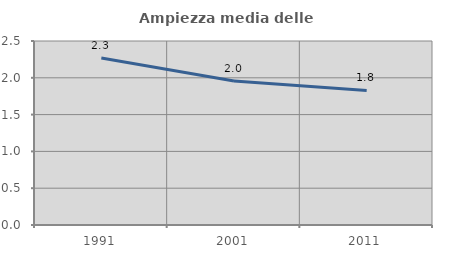
| Category | Ampiezza media delle famiglie |
|---|---|
| 1991.0 | 2.27 |
| 2001.0 | 1.956 |
| 2011.0 | 1.828 |